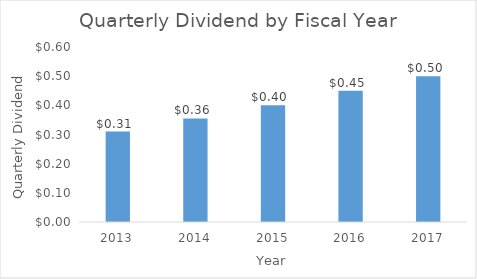
| Category | Series 0 |
|---|---|
| 2013.0 | 0.31 |
| 2014.0 | 0.355 |
| 2015.0 | 0.4 |
| 2016.0 | 0.45 |
| 2017.0 | 0.5 |